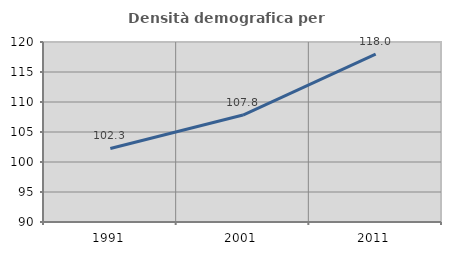
| Category | Densità demografica |
|---|---|
| 1991.0 | 102.256 |
| 2001.0 | 107.821 |
| 2011.0 | 117.993 |